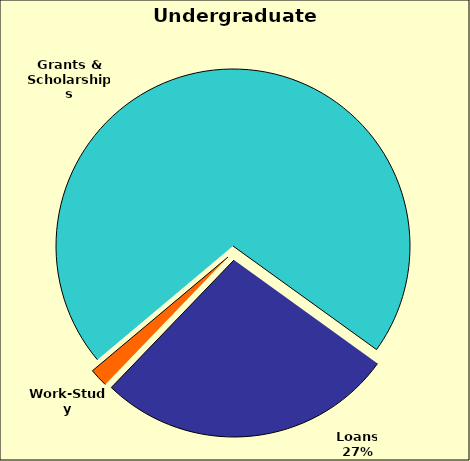
| Category | Series 0 |
|---|---|
| Grants & Scholarships | 0.711 |
| Loans | 0.272 |
| Work-Study | 0.017 |